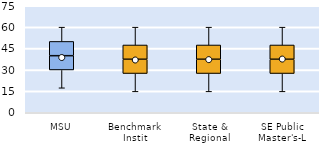
| Category | 25th | 50th | 75th |
|---|---|---|---|
| MSU | 30 | 10 | 10 |
| Benchmark Instit | 27.5 | 10 | 10 |
| State & Regional | 27.5 | 10 | 10 |
| SE Public Master's-L | 27.5 | 10 | 10 |